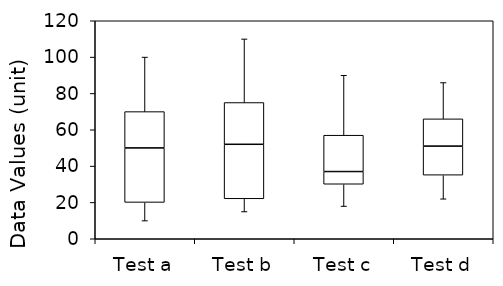
| Category | Min | Q1 | Median | Q3 | Max |
|---|---|---|---|---|---|
| Test a | 10 | 10 | 30 | 20 | 30 |
| Test b | 15 | 7 | 30 | 23 | 35 |
| Test c | 18 | 12 | 7 | 20 | 33 |
| Test d | 22 | 13 | 16 | 15 | 20 |